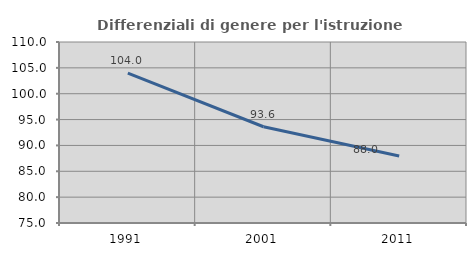
| Category | Differenziali di genere per l'istruzione superiore |
|---|---|
| 1991.0 | 103.991 |
| 2001.0 | 93.614 |
| 2011.0 | 87.955 |